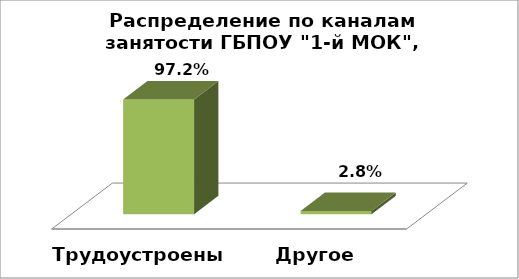
| Category | Series 0 |
|---|---|
| Трудоустроены | 0.972 |
| Другое | 0.028 |